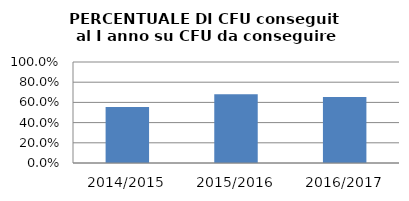
| Category | 2014/2015 2015/2016 2016/2017 |
|---|---|
| 2014/2015 | 0.555 |
| 2015/2016 | 0.681 |
| 2016/2017 | 0.653 |